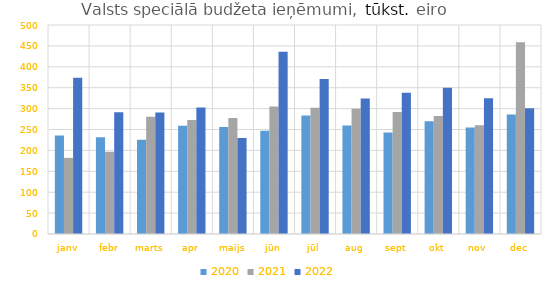
| Category | 2020 | 2021 | 2022 |
|---|---|---|---|
| janv | 235581.606 | 182213.528 | 373920.799 |
| febr | 231251.664 | 196739.364 | 291303.596 |
| marts | 225206.856 | 280261.929 | 290859.027 |
| apr | 258832.404 | 272916.721 | 302459.796 |
| maijs | 256203.758 | 277554.305 | 229777.32 |
| jūn | 247189.712 | 304993.499 | 435953.091 |
| jūl | 283516.218 | 302140.072 | 370694.27 |
| aug | 259698.416 | 299731.991 | 324382.079 |
| sept | 242624.019 | 292093.132 | 337952.536 |
| okt | 269550.251 | 282344.858 | 349920.822 |
| nov | 254562.176 | 260178.761 | 324970.324 |
| dec | 286098.933 | 458943.507 | 300963.059 |